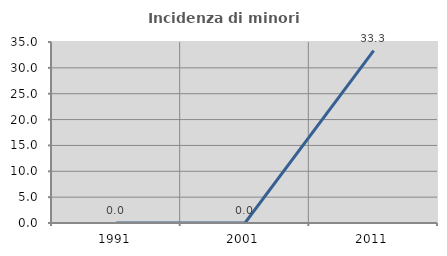
| Category | Incidenza di minori stranieri |
|---|---|
| 1991.0 | 0 |
| 2001.0 | 0 |
| 2011.0 | 33.333 |